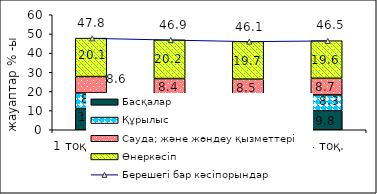
| Category | Басқалар | Құрылыс | Сауда; және жөндеу қызметтері | Өнеркәсіп |
|---|---|---|---|---|
| 1 тоқ. 2008  | 10.86 | 8.35 | 8.55 | 20.05 |
| 2 тоқ. | 10.44 | 7.89 | 8.39 | 20.19 |
| 3 тоқ. | 9.93 | 7.94 | 8.54 | 19.68 |
| 4 тоқ. | 9.84 | 8.33 | 8.69 | 19.61 |